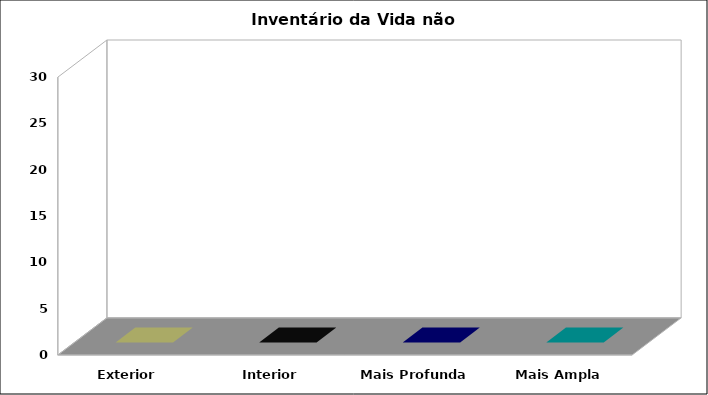
| Category | Pontos |
|---|---|
| Exterior | 0 |
| Interior | 0 |
| Mais Profunda | 0 |
| Mais Ampla | 0 |